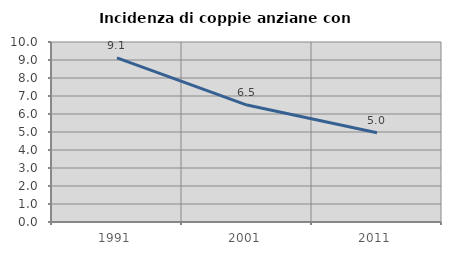
| Category | Incidenza di coppie anziane con figli |
|---|---|
| 1991.0 | 9.116 |
| 2001.0 | 6.497 |
| 2011.0 | 4.954 |